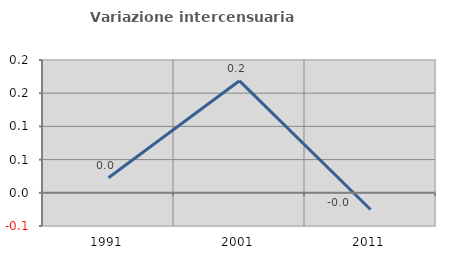
| Category | Variazione intercensuaria annua |
|---|---|
| 1991.0 | 0.023 |
| 2001.0 | 0.169 |
| 2011.0 | -0.025 |